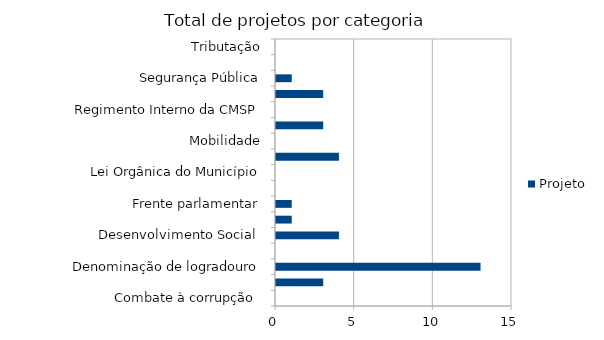
| Category | Projeto |
|---|---|
| Combate à corrupção  | 0 |
| Datas comemorativas e homenagens diversas | 3 |
| Denominação de logradouro | 13 |
| Desenvolvimento Econômico | 0 |
| Desenvolvimento Social  | 4 |
| Educação e cultura | 1 |
| Frente parlamentar | 1 |
| Habitação e Urbanismo | 0 |
| Lei Orgânica do Município | 0 |
| Meio ambiente ,  | 4 |
| Mobilidade | 0 |
| Proteção dos animais | 3 |
| Regimento Interno da CMSP | 0 |
| Saude-Esporte | 3 |
| Segurança Pública | 1 |
| Transparencia | 0 |
| Tributação | 0 |